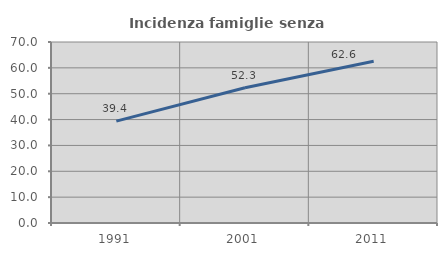
| Category | Incidenza famiglie senza nuclei |
|---|---|
| 1991.0 | 39.409 |
| 2001.0 | 52.321 |
| 2011.0 | 62.553 |